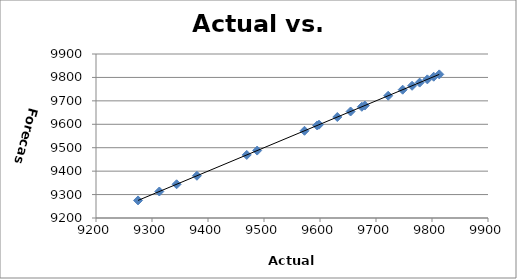
| Category | Forecast |
|---|---|
| 9343.96 | 9343.96 |
| 9313.08 | 9313.08 |
| 9380.24 | 9380.24 |
| 9275.06 | 9275.06 |
| 9469.2 | 9469.2 |
| 9487.8 | 9487.8 |
| 9572.31 | 9572.31 |
| 9594.98 | 9594.98 |
| 9654.61 | 9654.61 |
| 9630.9 | 9630.9 |
| 9680.01 | 9680.01 |
| 9674.68 | 9674.68 |
| 9764.38 | 9764.38 |
| 9812.98 | 9812.98 |
| 9803.05 | 9803.05 |
| 9791.72 | 9791.72 |
| 9721.79 | 9721.79 |
| 9777.94 | 9777.94 |
| 9747.64 | 9747.64 |
| 9598.24 | 9598.24 |